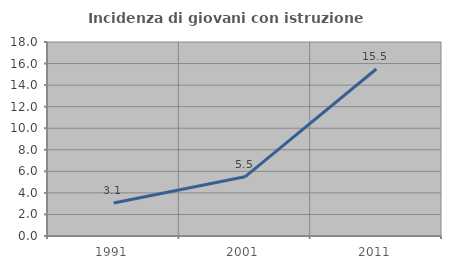
| Category | Incidenza di giovani con istruzione universitaria |
|---|---|
| 1991.0 | 3.067 |
| 2001.0 | 5.492 |
| 2011.0 | 15.493 |